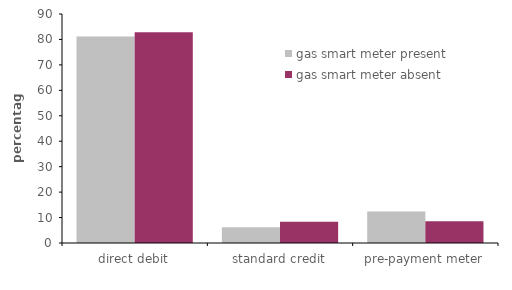
| Category | gas smart meter present | gas smart meter absent |
|---|---|---|
| direct debit | 81.15 | 82.814 |
| standard credit | 6.143 | 8.365 |
| pre-payment meter | 12.365 | 8.507 |